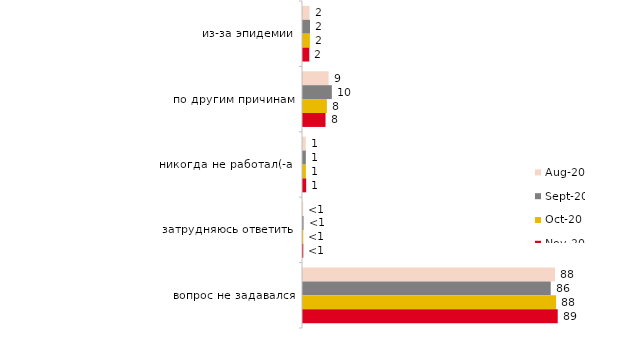
| Category | авг.20 | сен.20 | окт.20 | ноя.20 |
|---|---|---|---|---|
| из-за эпидемии | 2.284 | 2.439 | 2.392 | 2.2 |
| по другим причинам | 8.937 | 10.055 | 8.321 | 7.85 |
| никогда не работал(-а) | 0.943 | 0.996 | 0.997 | 1.1 |
| затрудняюсь ответить | 0.05 | 0.199 | 0.1 | 0.1 |
| вопрос не задавался | 87.786 | 86.312 | 88.191 | 88.75 |